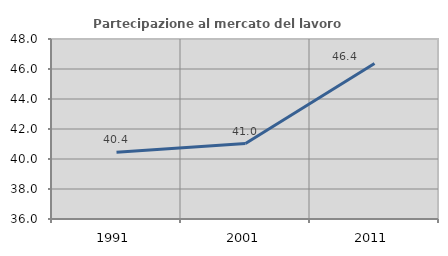
| Category | Partecipazione al mercato del lavoro  femminile |
|---|---|
| 1991.0 | 40.449 |
| 2001.0 | 41.027 |
| 2011.0 | 46.371 |